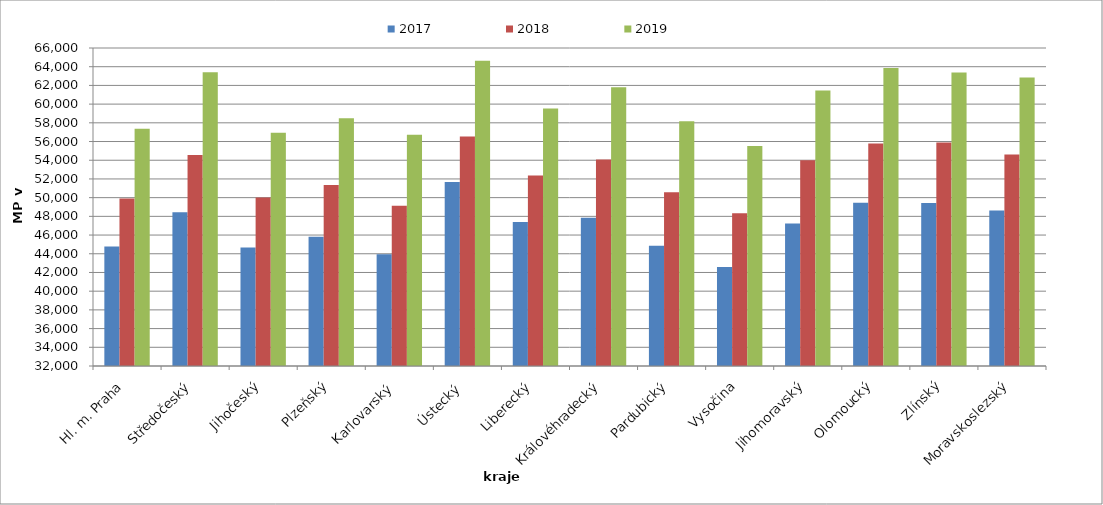
| Category | 2017 | 2018 | 2019 |
|---|---|---|---|
| Hl. m. Praha | 44771.128 | 49904.631 | 57360.776 |
| Středočeský | 48437.301 | 54554.544 | 63399.955 |
| Jihočeský | 44681.057 | 50008.192 | 56942.209 |
| Plzeňský | 45816.855 | 51358.478 | 58488.713 |
| Karlovarský  | 43957.367 | 49136.355 | 56713.025 |
| Ústecký   | 51679.366 | 56529.76 | 64635.787 |
| Liberecký | 47398.668 | 52379.243 | 59536.68 |
| Královéhradecký | 47862.115 | 54066.271 | 61792.574 |
| Pardubický | 44860.848 | 50587.324 | 58177.695 |
| Vysočina | 42582.707 | 48343.455 | 55533.269 |
| Jihomoravský | 47241.712 | 54010.471 | 61444.332 |
| Olomoucký | 49443.889 | 55800.939 | 63862.271 |
| Zlínský | 49437.673 | 55899.062 | 63374.135 |
| Moravskoslezský | 48628.609 | 54612.302 | 62848.166 |